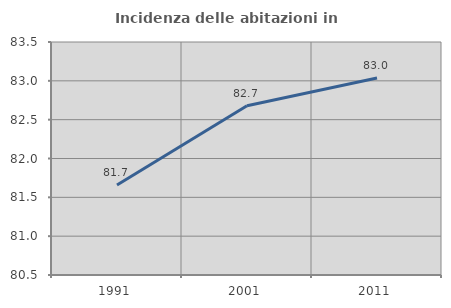
| Category | Incidenza delle abitazioni in proprietà  |
|---|---|
| 1991.0 | 81.659 |
| 2001.0 | 82.68 |
| 2011.0 | 83.036 |